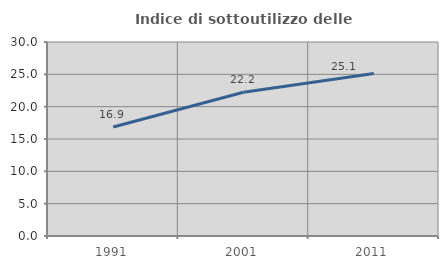
| Category | Indice di sottoutilizzo delle abitazioni  |
|---|---|
| 1991.0 | 16.853 |
| 2001.0 | 22.219 |
| 2011.0 | 25.126 |